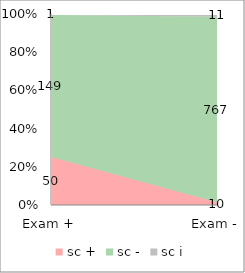
| Category | sc + | sc - | sc i |
|---|---|---|---|
| Exam + | 50 | 149 | 1 |
| Exam - | 10 | 767 | 11 |